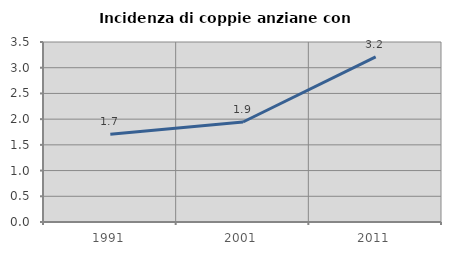
| Category | Incidenza di coppie anziane con figli |
|---|---|
| 1991.0 | 1.705 |
| 2001.0 | 1.944 |
| 2011.0 | 3.21 |